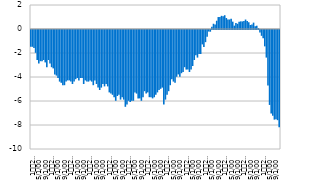
| Category |  Фискални резултат |
|---|---|
| 1
2008. | -1.4 |
| 2 | -1.4 |
| 3 | -1.5 |
| 4 | -1.9 |
| 5 | -2.5 |
| 6 | -2.8 |
| 7 | -2.6 |
| 8 | -2.6 |
| 9 | -2.5 |
| 10 | -2.7 |
| 11 | -3.1 |
| 12 | -2.5 |
| 1
2009. | -2.8 |
| 2 | -3.1 |
| 3 | -3.2 |
| 4 | -3.7 |
| 5 | -3.8 |
| 6 | -4 |
| 7 | -4.3 |
| 8 | -4.4 |
| 9 | -4.6 |
| 10 | -4.6 |
| 11 | -4.3 |
| 12 | -4.2 |
| 1
2010. | -4.2 |
| 2 | -4.3 |
| 3 | -4.5 |
| 4 | -4.3 |
| 5 | -4.1 |
| 6 | -4 |
| 7 | -4.2 |
| 8 | -4 |
| 9 | -4 |
| 10 | -4.5 |
| 11 | -4.2 |
| 12 | -4.3 |
| 1
2011. | -4.3 |
| 2 | -4.2 |
| 3 | -4.3 |
| 4 | -4.6 |
| 5 | -4.2 |
| 6 | -4.5 |
| 7 | -4.8 |
| 8 | -5 |
| 9 | -4.8 |
| 10 | -4.5 |
| 11 | -4.7 |
| 12 | -4.5 |
| 1
2012. | -4.7 |
| 2 | -5.2 |
| 3 | -5.3 |
| 4 | -5.4 |
| 5 | -5.6 |
| 6 | -5.9 |
| 7 | -5.5 |
| 8 | -5.4 |
| 9 | -5.8 |
| 10 | -5.6 |
| 11 | -5.8 |
| 12 | -6.4 |
| 1
2013. | -6.2 |
| 2 | -5.9 |
| 3 | -6 |
| 4 | -5.9 |
| 5 | -5.9 |
| 6 | -5.2 |
| 7 | -5.3 |
| 8 | -5.7 |
| 9 | -5.7 |
| 10 | -5.9 |
| 11 | -5.6 |
| 12 | -5.1 |
| 1
2014. | -5.3 |
| 2 | -5.2 |
| 3 | -5.6 |
| 4 | -5.6 |
| 5 | -5.7 |
| 6 | -5.6 |
| 7 | -5.4 |
| 8 | -5.2 |
| 9 | -5 |
| 10 | -4.9 |
| 11 | -4.8 |
| 12 | -6.2 |
| 1
2015. | -5.8 |
| 2 | -5.4 |
| 3 | -5.1 |
| 4 | -4.6 |
| 5 | -4.1 |
| 6 | -4.3 |
| 7 | -4.4 |
| 8 | -3.9 |
| 9 | -3.7 |
| 10 | -3.9 |
| 11 | -3.6 |
| 12 | -3.5 |
| 1
2016. | -3.1 |
| 2 | -3.3 |
| 3 | -3.3 |
| 4 | -3.5 |
| 5 | -3.3 |
| 6 | -3 |
| 7 | -2.5 |
| 8 | -2.1 |
| 9 | -2.3 |
| 10 | -2 |
| 11 | -2 |
| 12 | -1.2 |
| 1
2017. | -1.41 |
| 2 | -1.013 |
| 3 | -0.572 |
| 4 | -0.129 |
| 5 | -0.143 |
| 6 | 0.181 |
| 7 | 0.438 |
| 8 | 0.366 |
| 9 | 0.689 |
| 10 | 0.996 |
| 11 | 0.99 |
| 12 | 1.099 |
| 1
2018. | 1.053 |
| 2 | 1.148 |
| 3 | 0.914 |
| 4 | 0.786 |
| 5 | 0.792 |
| 6 | 0.85 |
| 7 | 0.612 |
| 8 | 0.28 |
| 9 | 0.508 |
| 10 | 0.434 |
| 11 | 0.597 |
| 12 | 0.635 |
| 1
2019. | 0.63 |
| 2 | 0.667 |
| 3 | 0.788 |
| 4 | 0.662 |
| 5 | 0.562 |
| 6 | 0.332 |
| 7 | 0.382 |
| 8 | 0.531 |
| 9 | 0.228 |
| 10 | 0.275 |
| 11 | 0.077 |
| 12 | -0.205 |
| 1
2020. | -0.485 |
| 2 | -0.684 |
| 3 | -1.364 |
| 4 | -2.299 |
| 5 | -4.622 |
| 6 | -6.244 |
| 7 | -6.968 |
| 8 | -7.145 |
| 9 | -7.471 |
| 10 | -7.429 |
| 11 | -7.514 |
| 12 | -8.104 |